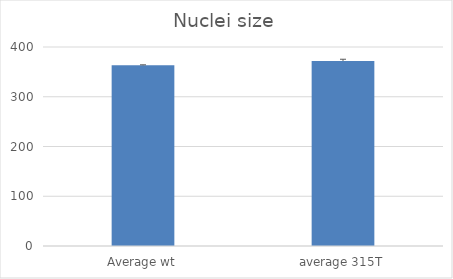
| Category | Series 0 |
|---|---|
| Average wt | 363.208 |
| average 315T | 371.988 |